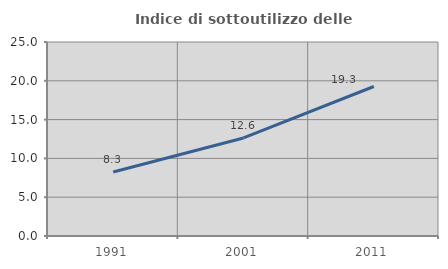
| Category | Indice di sottoutilizzo delle abitazioni  |
|---|---|
| 1991.0 | 8.25 |
| 2001.0 | 12.635 |
| 2011.0 | 19.265 |